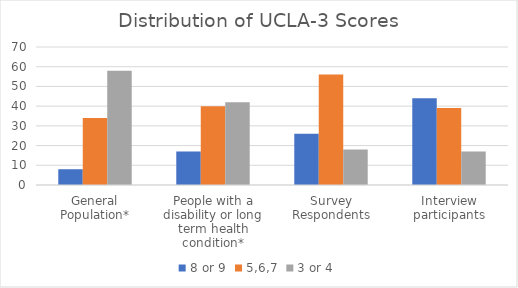
| Category | 8 or 9 | 5,6,7 | 3 or 4 |
|---|---|---|---|
| General Population* | 8 | 34 | 58 |
| People with a disability or long term health condition* | 17 | 40 | 42 |
| Survey Respondents | 26 | 56 | 18 |
| Interview participants | 44 | 39 | 17 |